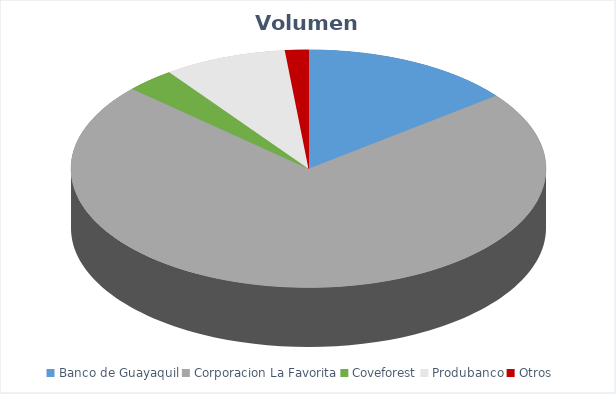
| Category | VOLUMEN ($USD) |
|---|---|
| Banco de Guayaquil | 17305.68 |
| Corporacion La Favorita | 86531.09 |
| Coveforest | 4001.4 |
| Produbanco | 10010 |
| Otros | 1905.4 |